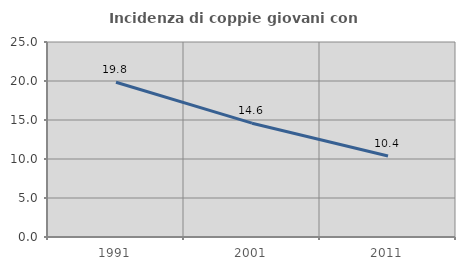
| Category | Incidenza di coppie giovani con figli |
|---|---|
| 1991.0 | 19.835 |
| 2001.0 | 14.592 |
| 2011.0 | 10.39 |